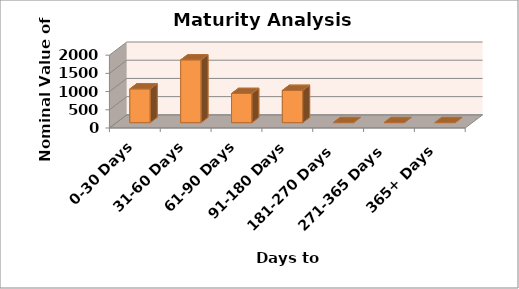
| Category | Nominal |
|---|---|
| 0-30 Days | 926000000 |
| 31-60 Days | 1723000000 |
| 61-90 Days | 800000000 |
| 91-180 Days | 885000000 |
| 181-270 Days | 0 |
| 271-365 Days | 0 |
| 365+ Days | 0 |